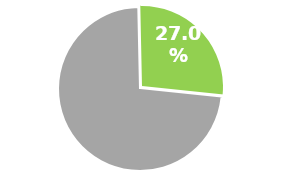
| Category | Series 0 |
|---|---|
| 0 | 0.73 |
| 1 | 0.27 |